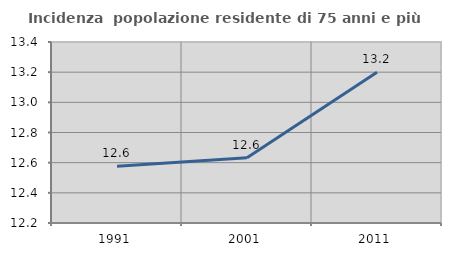
| Category | Incidenza  popolazione residente di 75 anni e più |
|---|---|
| 1991.0 | 12.577 |
| 2001.0 | 12.633 |
| 2011.0 | 13.199 |